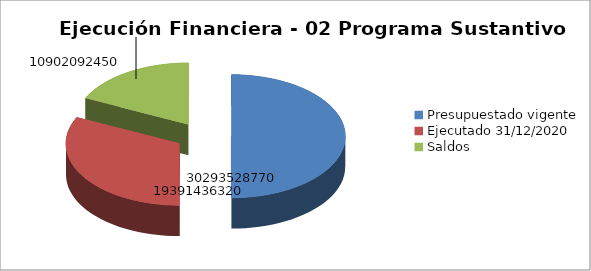
| Category | 0 0 |
|---|---|
| Presupuestado vigente | 30293528770 |
| Ejecutado 31/12/2020 | 19391436320 |
| Saldos | 10902092450 |